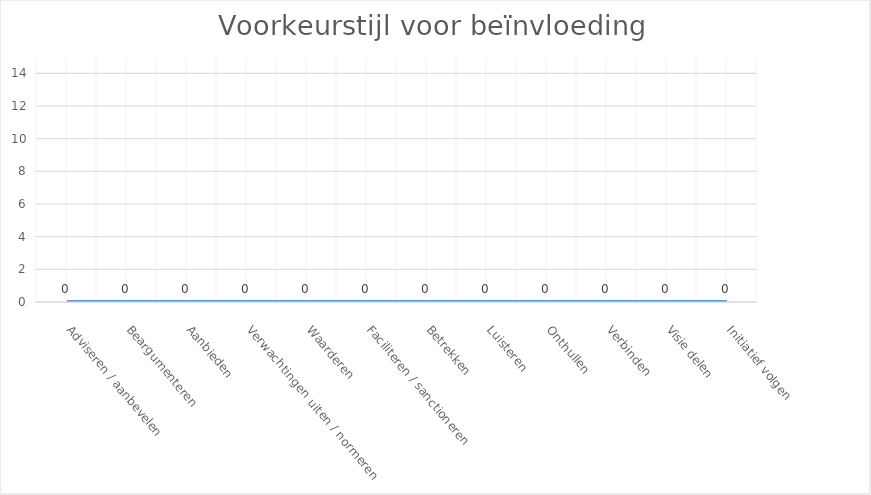
| Category | Series 0 |
|---|---|
| Adviseren / aanbevelen | 0 |
| Beargumenteren | 0 |
| Aanbieden | 0 |
| Verwachtingen uiten / normeren | 0 |
| Waarderen | 0 |
| Faciliteren / sanctioneren | 0 |
| Betrekken | 0 |
| Luisteren | 0 |
| Onthullen | 0 |
| Verbinden | 0 |
| Visie delen | 0 |
| Initiatief volgen | 0 |